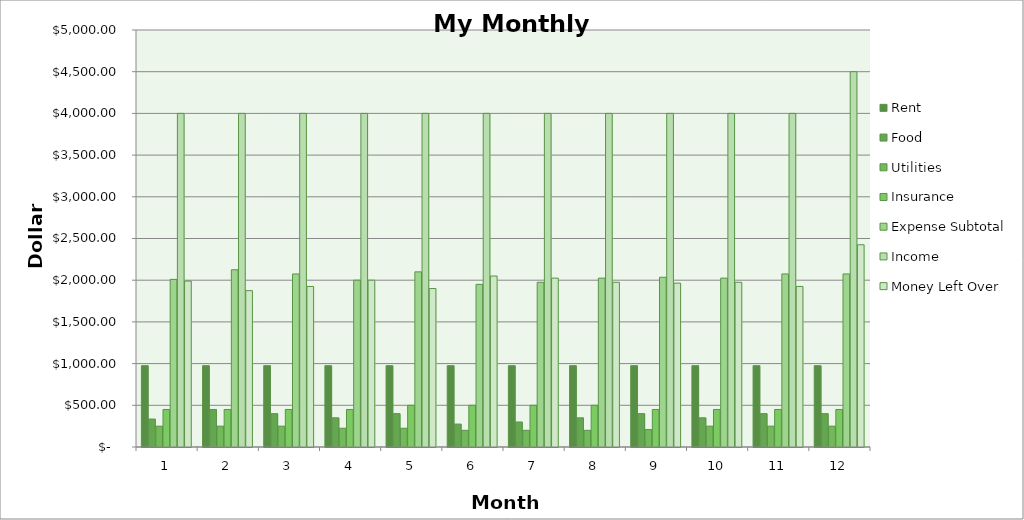
| Category | Rent | Food | Utilities | Insurance | Expense Subtotal | Income | Money Left Over |
|---|---|---|---|---|---|---|---|
| 0 | 975 | 335 | 250 | 450 | 2010 | 4000 | 1990 |
| 1 | 975 | 450 | 250 | 450 | 2125 | 4000 | 1875 |
| 2 | 975 | 400 | 250 | 450 | 2075 | 4000 | 1925 |
| 3 | 975 | 350 | 225 | 450 | 2000 | 4000 | 2000 |
| 4 | 975 | 400 | 225 | 500 | 2100 | 4000 | 1900 |
| 5 | 975 | 275 | 200 | 500 | 1950 | 4000 | 2050 |
| 6 | 975 | 300 | 200 | 500 | 1975 | 4000 | 2025 |
| 7 | 975 | 350 | 200 | 500 | 2025 | 4000 | 1975 |
| 8 | 975 | 400 | 210 | 450 | 2035 | 4000 | 1965 |
| 9 | 975 | 350 | 250 | 450 | 2025 | 4000 | 1975 |
| 10 | 975 | 400 | 250 | 450 | 2075 | 4000 | 1925 |
| 11 | 975 | 400 | 250 | 450 | 2075 | 4500 | 2425 |